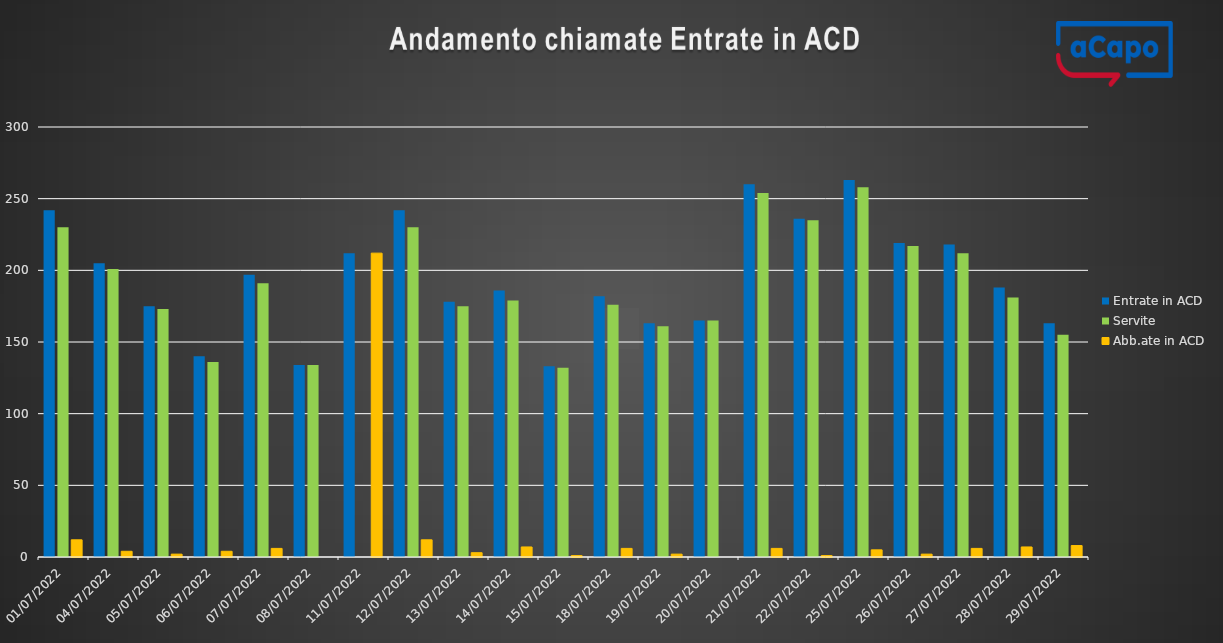
| Category | Entrate in ACD | Servite | Abb.ate in ACD |
|---|---|---|---|
| 01/07/2022 | 242 | 230 | 12 |
| 04/07/2022 | 205 | 201 | 4 |
| 05/07/2022 | 175 | 173 | 2 |
| 06/07/2022 | 140 | 136 | 4 |
| 07/07/2022 | 197 | 191 | 6 |
| 08/07/2022 | 134 | 134 | 0 |
| 11/07/2022 | 212 | 0 | 212 |
| 12/07/2022 | 242 | 230 | 12 |
| 13/07/2022 | 178 | 175 | 3 |
| 14/07/2022 | 186 | 179 | 7 |
| 15/07/2022 | 133 | 132 | 1 |
| 18/07/2022 | 182 | 176 | 6 |
| 19/07/2022 | 163 | 161 | 2 |
| 20/07/2022 | 165 | 165 | 0 |
| 21/07/2022 | 260 | 254 | 6 |
| 22/07/2022 | 236 | 235 | 1 |
| 25/07/2022 | 263 | 258 | 5 |
| 26/07/2022 | 219 | 217 | 2 |
| 27/07/2022 | 218 | 212 | 6 |
| 28/07/2022 | 188 | 181 | 7 |
| 29/07/2022 | 163 | 155 | 8 |